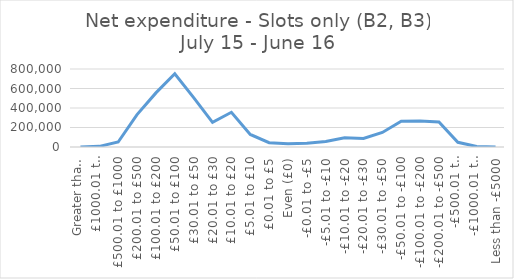
| Category | Slots only (B2, B3) |
|---|---|
| Greater than £5000 | 2 |
| £1000.01 to £5000 | 6781 |
| £500.01 to £1000 | 51478 |
| £200.01 to £500 | 332324 |
| £100.01 to £200 | 554951 |
| £50.01 to £100 | 750796 |
| £30.01 to £50 | 506395 |
| £20.01 to £30 | 253420 |
| £10.01 to £20 | 356106 |
| £5.01 to £10 | 128638 |
| £0.01 to £5 | 43945 |
| Even (£0) | 34012 |
| -£0.01 to -£5 | 38809 |
| -£5.01 to -£10 | 56564 |
| -£10.01 to -£20 | 95293 |
| -£20.01 to -£30 | 86936 |
| -£30.01 to -£50 | 149518 |
| -£50.01 to -£100 | 264341 |
| -£100.01 to -£200 | 266025 |
| -£200.01 to -£500 | 256944 |
| -£500.01 to -£1000 | 48368 |
| -£1000.01 to -£5000 | 4953 |
| Less than -£5000 | 6 |